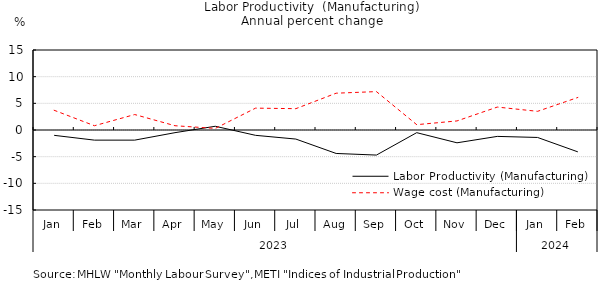
| Category | Labor Productivity (Manufacturing) | Wage cost (Manufacturing) |
|---|---|---|
| 0 | -1 | 3.7 |
| 1 | -1.9 | 0.8 |
| 2 | -1.9 | 2.9 |
| 3 | -0.5 | 0.8 |
| 4 | 0.7 | 0.3 |
| 5 | -1 | 4.1 |
| 6 | -1.7 | 4 |
| 7 | -4.4 | 6.9 |
| 8 | -4.7 | 7.2 |
| 9 | -0.5 | 1 |
| 10 | -2.4 | 1.7 |
| 11 | -1.2 | 4.3 |
| 12 | -1.4 | 3.5 |
| 13 | -4.1 | 6.1 |